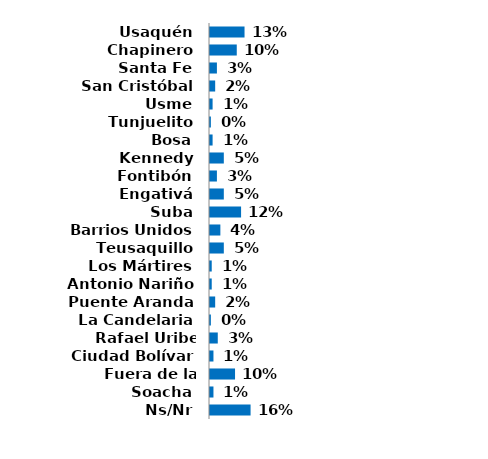
| Category | Series 0 |
|---|---|
| Usaquén | 0.133 |
| Chapinero | 0.103 |
| Santa Fe | 0.027 |
| San Cristóbal | 0.02 |
| Usme | 0.01 |
| Tunjuelito | 0.003 |
| Bosa | 0.01 |
| Kennedy | 0.053 |
| Fontibón | 0.027 |
| Engativá | 0.053 |
| Suba | 0.12 |
| Barrios Unidos | 0.04 |
| Teusaquillo | 0.053 |
| Los Mártires | 0.007 |
| Antonio Nariño | 0.007 |
| Puente Aranda | 0.02 |
| La Candelaria | 0.003 |
| Rafael Uribe Uribe | 0.03 |
| Ciudad Bolívar | 0.013 |
| Fuera de la ciudad | 0.097 |
| Soacha | 0.013 |
| Ns/Nr | 0.157 |